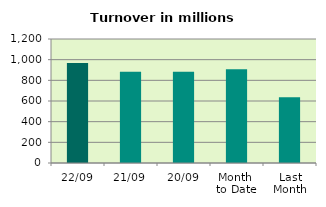
| Category | Series 0 |
|---|---|
| 22/09 | 967.436 |
| 21/09 | 883.43 |
| 20/09 | 881.914 |
| Month 
to Date | 908.084 |
| Last
Month | 635.477 |